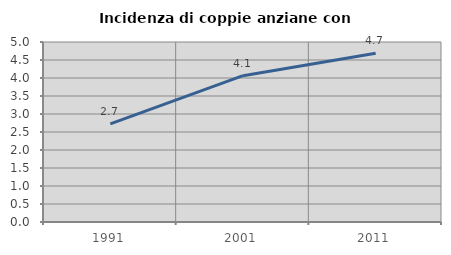
| Category | Incidenza di coppie anziane con figli |
|---|---|
| 1991.0 | 2.724 |
| 2001.0 | 4.065 |
| 2011.0 | 4.685 |